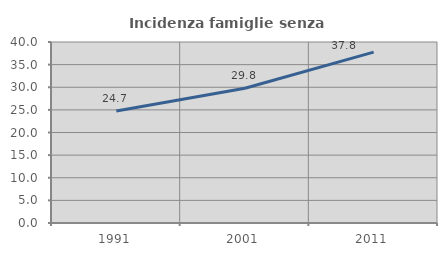
| Category | Incidenza famiglie senza nuclei |
|---|---|
| 1991.0 | 24.733 |
| 2001.0 | 29.768 |
| 2011.0 | 37.759 |